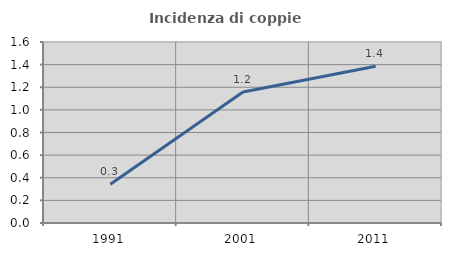
| Category | Incidenza di coppie miste |
|---|---|
| 1991.0 | 0.342 |
| 2001.0 | 1.158 |
| 2011.0 | 1.386 |